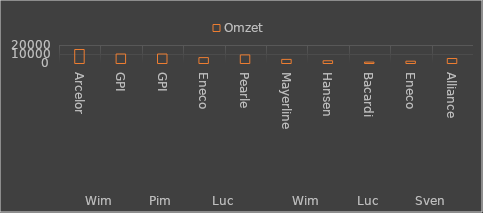
| Category | Omzet |
|---|---|
| 0 | 15000 |
| 1 | 10000 |
| 2 | 10000 |
| 3 | 6000 |
| 4 | 9000 |
| 5 | 4000 |
| 6 | 2500 |
| 7 | 1000 |
| 8 | 2000 |
| 9 | 5000 |